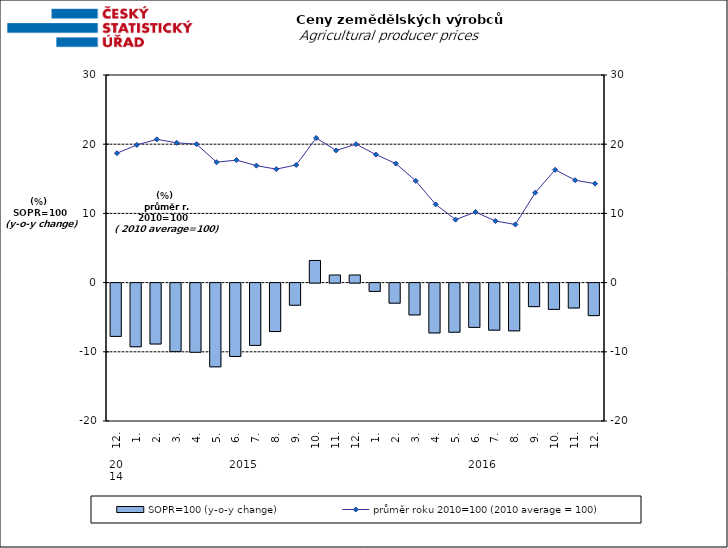
| Category | SOPR=100 (y-o-y change)   |
|---|---|
| 0 | -7.7 |
| 1 | -9.2 |
| 2 | -8.8 |
| 3 | -9.9 |
| 4 | -10 |
| 5 | -12.1 |
| 6 | -10.6 |
| 7 | -9 |
| 8 | -7 |
| 9 | -3.2 |
| 10 | 3.2 |
| 11 | 1.1 |
| 12 | 1.1 |
| 13 | -1.2 |
| 14 | -2.9 |
| 15 | -4.6 |
| 16 | -7.2 |
| 17 | -7.1 |
| 18 | -6.4 |
| 19 | -6.8 |
| 20 | -6.9 |
| 21 | -3.4 |
| 22 | -3.8 |
| 23 | -3.6 |
| 24 | -4.7 |